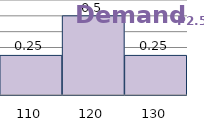
| Category | Series 1 |
|---|---|
| 110.0 | 0.25 |
| 120.0 | 0.5 |
| 130.0 | 0.25 |